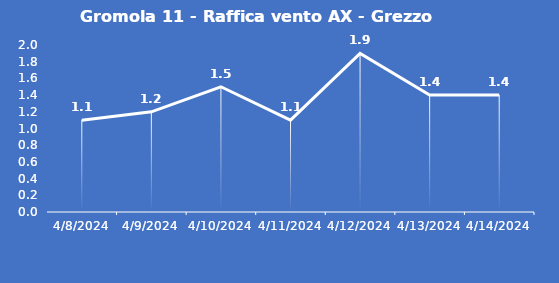
| Category | Gromola 11 - Raffica vento AX - Grezzo (m/s) |
|---|---|
| 4/8/24 | 1.1 |
| 4/9/24 | 1.2 |
| 4/10/24 | 1.5 |
| 4/11/24 | 1.1 |
| 4/12/24 | 1.9 |
| 4/13/24 | 1.4 |
| 4/14/24 | 1.4 |